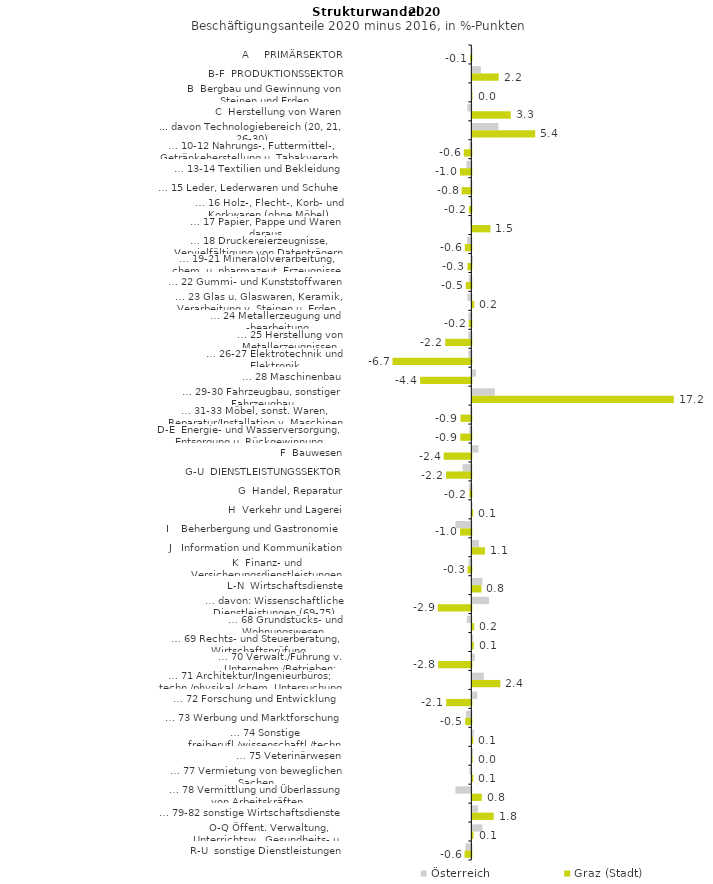
| Category | Österreich | Graz (Stadt) |
|---|---|---|
| A     PRIMÄRSEKTOR | 0.018 | -0.095 |
| B-F  PRODUKTIONSSEKTOR | 0.731 | 2.248 |
| B  Bergbau und Gewinnung von Steinen und Erden | -0.006 | 0.017 |
| C  Herstellung von Waren | -0.347 | 3.277 |
| ... davon Technologiebereich (20, 21, 26-30) | 2.213 | 5.36 |
| … 10-12 Nahrungs-, Futtermittel-, Getränkeherstellung u. Tabakverarb. | -0.156 | -0.643 |
| … 13-14 Textilien und Bekleidung | -0.417 | -0.978 |
| … 15 Leder, Lederwaren und Schuhe | -0.095 | -0.831 |
| … 16 Holz-, Flecht-, Korb- und Korkwaren (ohne Möbel)  | 0.023 | -0.212 |
| … 17 Papier, Pappe und Waren daraus  | -0.11 | 1.541 |
| … 18 Druckereierzeugnisse, Vervielfältigung von Datenträgern | -0.357 | -0.556 |
| … 19-21 Mineralölverarbeitung, chem. u. pharmazeut. Erzeugnisse | 0.063 | -0.33 |
| … 22 Gummi- und Kunststoffwaren | -0.217 | -0.474 |
| … 23 Glas u. Glaswaren, Keramik, Verarbeitung v. Steinen u. Erden  | -0.33 | 0.162 |
| … 24 Metallerzeugung und -bearbeitung | -0.251 | -0.221 |
| … 25 Herstellung von Metallerzeugnissen  | -0.261 | -2.218 |
| … 26-27 Elektrotechnik und Elektronik | -0.258 | -6.716 |
| … 28 Maschinenbau | 0.309 | -4.363 |
| … 29-30 Fahrzeugbau, sonstiger Fahrzeugbau | 1.924 | 17.173 |
| … 31-33 Möbel, sonst. Waren, Reparatur/Installation v. Maschinen | -0.089 | -0.926 |
| D-E  Energie- und Wasserversorgung, Entsorgung u. Rückgewinnung | -0.17 | -0.938 |
| F  Bauwesen | 0.522 | -2.356 |
| G-U  DIENSTLEISTUNGSSEKTOR | -0.749 | -2.153 |
| G  Handel, Reparatur | -0.208 | -0.173 |
| H  Verkehr und Lagerei | 0.02 | 0.068 |
| I    Beherbergung und Gastronomie | -1.357 | -0.957 |
| J   Information und Kommunikation | 0.559 | 1.084 |
| K  Finanz- und Versicherungsdienstleistungen | -0.241 | -0.324 |
| L-N  Wirtschaftsdienste | 0.862 | 0.778 |
| … davon: Wissenschaftliche Dienstleistungen (69-75) | 1.424 | -2.862 |
| … 68 Grundstücks- und Wohnungswesen  | -0.382 | 0.156 |
| … 69 Rechts- und Steuerberatung, Wirtschaftsprüfung | 0.071 | 0.126 |
| … 70 Verwalt./Führung v. Unternehm./Betrieben; Unternehmensberat. | 0.205 | -2.827 |
| … 71 Architektur/Ingenieurbüros; techn./physikal./chem. Untersuchung | 0.976 | 2.39 |
| … 72 Forschung und Entwicklung  | 0.423 | -2.144 |
| … 73 Werbung und Marktforschung | -0.459 | -0.522 |
| … 74 Sonstige freiberufl./wissenschaftl./techn. Tätigkeiten | 0.13 | 0.085 |
| … 75 Veterinärwesen | 0.078 | 0.029 |
| … 77 Vermietung von beweglichen Sachen  | -0.163 | 0.087 |
| … 78 Vermittlung und Überlassung von Arbeitskräften | -1.357 | 0.812 |
| … 79-82 sonstige Wirtschaftsdienste | 0.479 | 1.817 |
| O-Q Öffent. Verwaltung, Unterrichtsw., Gesundheits- u. Sozialwesen | 0.859 | 0.102 |
| R-U  sonstige Dienstleistungen | -0.495 | -0.58 |